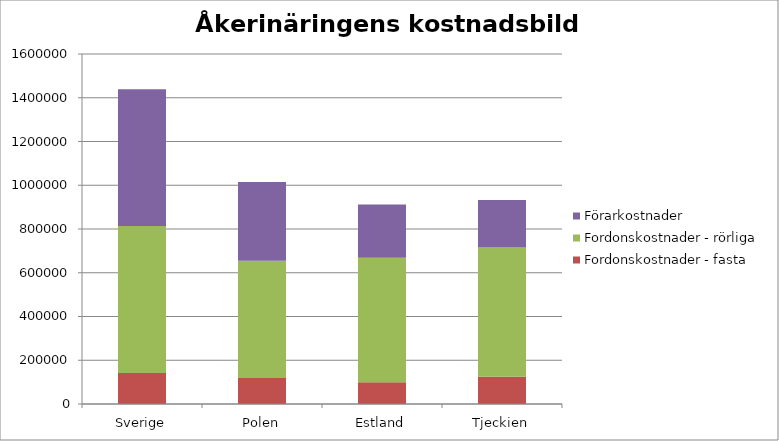
| Category | Fordonskostnader - fasta | Fordonskostnader - rörliga | Förarkostnader |
|---|---|---|---|
| Sverige | 141267.25 | 672419.67 | 625098 |
| Polen | 118556.501 | 536458.171 | 359835.881 |
| Estland | 99913.965 | 568268.854 | 244240.603 |
| Tjeckien | 124402.861 | 591224.15 | 216706.3 |